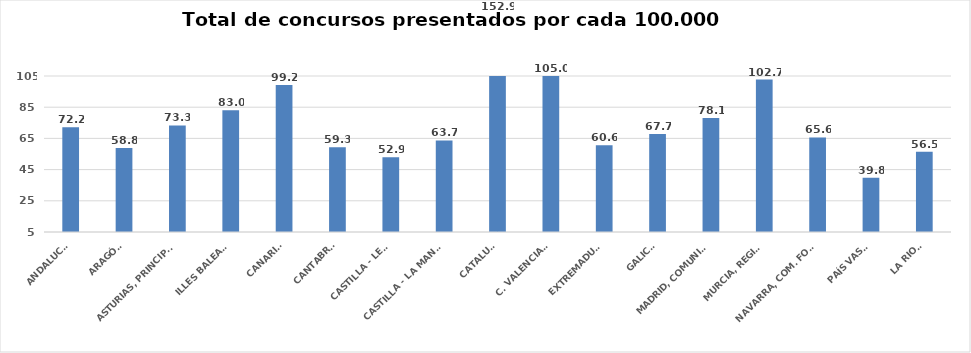
| Category | Series 0 |
|---|---|
| ANDALUCÍA | 72.154 |
| ARAGÓN | 58.844 |
| ASTURIAS, PRINCIPADO | 73.316 |
| ILLES BALEARS | 83.035 |
| CANARIAS | 99.191 |
| CANTABRIA | 59.3 |
| CASTILLA - LEÓN | 52.926 |
| CASTILLA - LA MANCHA | 63.683 |
| CATALUÑA | 152.866 |
| C. VALENCIANA | 104.977 |
| EXTREMADURA | 60.609 |
| GALICIA | 67.748 |
| MADRID, COMUNIDAD | 78.056 |
| MURCIA, REGIÓN | 102.725 |
| NAVARRA, COM. FORAL | 65.605 |
| PAÍS VASCO | 39.821 |
| LA RIOJA | 56.476 |